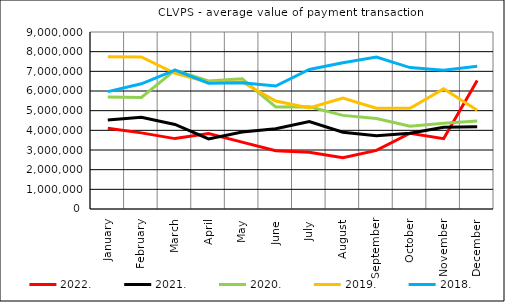
| Category | 2022. | 2021. | 2020. | 2019. | 2018. |
|---|---|---|---|---|---|
| January | 4102310.943 | 4530178.981 | 5699758.69 | 7742535.146 | 5966679.792 |
| February | 3871386.122 | 4665171.186 | 5673285.034 | 7734624.833 | 6366377.059 |
| March | 3579454.547 | 4301175.464 | 7058817.156 | 6894159.499 | 7064715.299 |
| April | 3834971.212 | 3565134.984 | 6507707.898 | 6438790.422 | 6397962.706 |
| May | 3401248.277 | 3911025.963 | 6619433.843 | 6457874.641 | 6425351.087 |
| June | 2966166.989 | 4079938.575 | 5191043.289 | 5491833.077 | 6253381.595 |
| July | 2881849.369 | 4441455.501 | 5193515.14 | 5133651.328 | 7098051.057 |
| August | 2604491.86 | 3902111.081 | 4759903.069 | 5642331.662 | 7437951.621 |
| September | 2977453.002 | 3723183.454 | 4601236.871 | 5128076.36 | 7723977.841 |
| October | 3851154.62 | 3848666.567 | 4212388.207 | 5119829.359 | 7191477.14 |
| November | 3574091.479 | 4153032.23 | 4363838.912 | 6109824.975 | 7052554.697 |
| December | 6534277.364 | 4181073.802 | 4472752.532 | 5021146.857 | 7257418.22 |